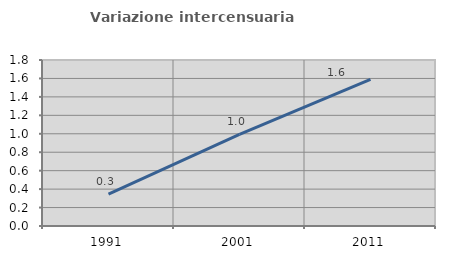
| Category | Variazione intercensuaria annua |
|---|---|
| 1991.0 | 0.345 |
| 2001.0 | 0.993 |
| 2011.0 | 1.59 |